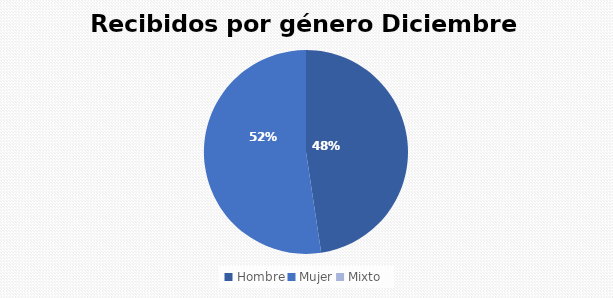
| Category | Recibidos por género  DICIEMBRE |
|---|---|
| Hombre | 20 |
| Mujer | 22 |
| Mixto | 0 |